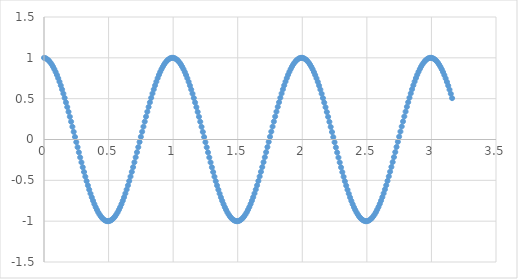
| Category | Series 0 |
|---|---|
| 0.0 | 1 |
| 0.01 | 0.996 |
| 0.02 | 0.988 |
| 0.03 | 0.976 |
| 0.04 | 0.961 |
| 0.05 | 0.941 |
| 0.060000000000000005 | 0.918 |
| 0.07 | 0.891 |
| 0.08 | 0.861 |
| 0.09 | 0.827 |
| 0.09999999999999999 | 0.79 |
| 0.10999999999999999 | 0.75 |
| 0.11999999999999998 | 0.707 |
| 0.12999999999999998 | 0.662 |
| 0.13999999999999999 | 0.613 |
| 0.15 | 0.562 |
| 0.16 | 0.509 |
| 0.17 | 0.454 |
| 0.18000000000000002 | 0.397 |
| 0.19000000000000003 | 0.339 |
| 0.20000000000000004 | 0.279 |
| 0.21000000000000005 | 0.218 |
| 0.22000000000000006 | 0.156 |
| 0.23000000000000007 | 0.094 |
| 0.24000000000000007 | 0.031 |
| 0.25000000000000006 | -0.032 |
| 0.26000000000000006 | -0.094 |
| 0.2700000000000001 | -0.157 |
| 0.2800000000000001 | -0.219 |
| 0.2900000000000001 | -0.279 |
| 0.3000000000000001 | -0.339 |
| 0.3100000000000001 | -0.398 |
| 0.3200000000000001 | -0.455 |
| 0.3300000000000001 | -0.51 |
| 0.34000000000000014 | -0.563 |
| 0.35000000000000014 | -0.613 |
| 0.36000000000000015 | -0.662 |
| 0.37000000000000016 | -0.708 |
| 0.38000000000000017 | -0.751 |
| 0.3900000000000002 | -0.791 |
| 0.4000000000000002 | -0.828 |
| 0.4100000000000002 | -0.861 |
| 0.4200000000000002 | -0.892 |
| 0.4300000000000002 | -0.918 |
| 0.4400000000000002 | -0.942 |
| 0.45000000000000023 | -0.961 |
| 0.46000000000000024 | -0.977 |
| 0.47000000000000025 | -0.988 |
| 0.48000000000000026 | -0.996 |
| 0.49000000000000027 | -1 |
| 0.5000000000000002 | -1 |
| 0.5100000000000002 | -0.996 |
| 0.5200000000000002 | -0.988 |
| 0.5300000000000002 | -0.976 |
| 0.5400000000000003 | -0.961 |
| 0.5500000000000003 | -0.941 |
| 0.5600000000000003 | -0.918 |
| 0.5700000000000003 | -0.891 |
| 0.5800000000000003 | -0.861 |
| 0.5900000000000003 | -0.827 |
| 0.6000000000000003 | -0.79 |
| 0.6100000000000003 | -0.75 |
| 0.6200000000000003 | -0.707 |
| 0.6300000000000003 | -0.661 |
| 0.6400000000000003 | -0.613 |
| 0.6500000000000004 | -0.562 |
| 0.6600000000000004 | -0.509 |
| 0.6700000000000004 | -0.454 |
| 0.6800000000000004 | -0.397 |
| 0.6900000000000004 | -0.338 |
| 0.7000000000000004 | -0.278 |
| 0.7100000000000004 | -0.218 |
| 0.7200000000000004 | -0.156 |
| 0.7300000000000004 | -0.093 |
| 0.7400000000000004 | -0.031 |
| 0.7500000000000004 | 0.032 |
| 0.7600000000000005 | 0.095 |
| 0.7700000000000005 | 0.157 |
| 0.7800000000000005 | 0.219 |
| 0.7900000000000005 | 0.28 |
| 0.8000000000000005 | 0.34 |
| 0.8100000000000005 | 0.398 |
| 0.8200000000000005 | 0.455 |
| 0.8300000000000005 | 0.51 |
| 0.8400000000000005 | 0.563 |
| 0.8500000000000005 | 0.614 |
| 0.8600000000000005 | 0.662 |
| 0.8700000000000006 | 0.708 |
| 0.8800000000000006 | 0.751 |
| 0.8900000000000006 | 0.791 |
| 0.9000000000000006 | 0.828 |
| 0.9100000000000006 | 0.862 |
| 0.9200000000000006 | 0.892 |
| 0.9300000000000006 | 0.919 |
| 0.9400000000000006 | 0.942 |
| 0.9500000000000006 | 0.961 |
| 0.9600000000000006 | 0.977 |
| 0.9700000000000006 | 0.988 |
| 0.9800000000000006 | 0.996 |
| 0.9900000000000007 | 1 |
| 1.0000000000000007 | 1 |
| 1.0100000000000007 | 0.996 |
| 1.0200000000000007 | 0.988 |
| 1.0300000000000007 | 0.976 |
| 1.0400000000000007 | 0.96 |
| 1.0500000000000007 | 0.941 |
| 1.0600000000000007 | 0.918 |
| 1.0700000000000007 | 0.891 |
| 1.0800000000000007 | 0.861 |
| 1.0900000000000007 | 0.827 |
| 1.1000000000000008 | 0.79 |
| 1.1100000000000008 | 0.75 |
| 1.1200000000000008 | 0.707 |
| 1.1300000000000008 | 0.661 |
| 1.1400000000000008 | 0.612 |
| 1.1500000000000008 | 0.561 |
| 1.1600000000000008 | 0.508 |
| 1.1700000000000008 | 0.453 |
| 1.1800000000000008 | 0.396 |
| 1.1900000000000008 | 0.338 |
| 1.2000000000000008 | 0.278 |
| 1.2100000000000009 | 0.217 |
| 1.2200000000000009 | 0.155 |
| 1.2300000000000009 | 0.093 |
| 1.2400000000000009 | 0.03 |
| 1.2500000000000009 | -0.033 |
| 1.260000000000001 | -0.095 |
| 1.270000000000001 | -0.158 |
| 1.280000000000001 | -0.22 |
| 1.290000000000001 | -0.28 |
| 1.300000000000001 | -0.34 |
| 1.310000000000001 | -0.399 |
| 1.320000000000001 | -0.455 |
| 1.330000000000001 | -0.51 |
| 1.340000000000001 | -0.564 |
| 1.350000000000001 | -0.614 |
| 1.360000000000001 | -0.663 |
| 1.370000000000001 | -0.708 |
| 1.380000000000001 | -0.751 |
| 1.390000000000001 | -0.791 |
| 1.400000000000001 | -0.828 |
| 1.410000000000001 | -0.862 |
| 1.420000000000001 | -0.892 |
| 1.430000000000001 | -0.919 |
| 1.440000000000001 | -0.942 |
| 1.450000000000001 | -0.961 |
| 1.460000000000001 | -0.977 |
| 1.470000000000001 | -0.988 |
| 1.480000000000001 | -0.996 |
| 1.490000000000001 | -1 |
| 1.500000000000001 | -1 |
| 1.5100000000000011 | -0.996 |
| 1.5200000000000011 | -0.988 |
| 1.5300000000000011 | -0.976 |
| 1.5400000000000011 | -0.96 |
| 1.5500000000000012 | -0.941 |
| 1.5600000000000012 | -0.918 |
| 1.5700000000000012 | -0.891 |
| 1.5800000000000012 | -0.86 |
| 1.5900000000000012 | -0.827 |
| 1.6000000000000012 | -0.79 |
| 1.6100000000000012 | -0.749 |
| 1.6200000000000012 | -0.706 |
| 1.6300000000000012 | -0.66 |
| 1.6400000000000012 | -0.612 |
| 1.6500000000000012 | -0.561 |
| 1.6600000000000013 | -0.508 |
| 1.6700000000000013 | -0.453 |
| 1.6800000000000013 | -0.396 |
| 1.6900000000000013 | -0.337 |
| 1.7000000000000013 | -0.277 |
| 1.7100000000000013 | -0.217 |
| 1.7200000000000013 | -0.155 |
| 1.7300000000000013 | -0.092 |
| 1.7400000000000013 | -0.03 |
| 1.7500000000000013 | 0.033 |
| 1.7600000000000013 | 0.096 |
| 1.7700000000000014 | 0.158 |
| 1.7800000000000014 | 0.22 |
| 1.7900000000000014 | 0.281 |
| 1.8000000000000014 | 0.341 |
| 1.8100000000000014 | 0.399 |
| 1.8200000000000014 | 0.456 |
| 1.8300000000000014 | 0.511 |
| 1.8400000000000014 | 0.564 |
| 1.8500000000000014 | 0.615 |
| 1.8600000000000014 | 0.663 |
| 1.8700000000000014 | 0.709 |
| 1.8800000000000014 | 0.752 |
| 1.8900000000000015 | 0.792 |
| 1.9000000000000015 | 0.829 |
| 1.9100000000000015 | 0.862 |
| 1.9200000000000015 | 0.892 |
| 1.9300000000000015 | 0.919 |
| 1.9400000000000015 | 0.942 |
| 1.9500000000000015 | 0.961 |
| 1.9600000000000015 | 0.977 |
| 1.9700000000000015 | 0.988 |
| 1.9800000000000015 | 0.996 |
| 1.9900000000000015 | 1 |
| 2.0000000000000013 | 1 |
| 2.010000000000001 | 0.996 |
| 2.020000000000001 | 0.988 |
| 2.0300000000000007 | 0.976 |
| 2.0400000000000005 | 0.96 |
| 2.0500000000000003 | 0.941 |
| 2.06 | 0.917 |
| 2.07 | 0.89 |
| 2.0799999999999996 | 0.86 |
| 2.0899999999999994 | 0.826 |
| 2.099999999999999 | 0.789 |
| 2.109999999999999 | 0.749 |
| 2.1199999999999988 | 0.706 |
| 2.1299999999999986 | 0.66 |
| 2.1399999999999983 | 0.611 |
| 2.149999999999998 | 0.561 |
| 2.159999999999998 | 0.507 |
| 2.1699999999999977 | 0.452 |
| 2.1799999999999975 | 0.395 |
| 2.1899999999999973 | 0.337 |
| 2.199999999999997 | 0.277 |
| 2.209999999999997 | 0.216 |
| 2.2199999999999966 | 0.154 |
| 2.2299999999999964 | 0.092 |
| 2.239999999999996 | 0.029 |
| 2.249999999999996 | -0.034 |
| 2.259999999999996 | -0.096 |
| 2.2699999999999956 | -0.159 |
| 2.2799999999999954 | -0.221 |
| 2.289999999999995 | -0.281 |
| 2.299999999999995 | -0.341 |
| 2.3099999999999947 | -0.4 |
| 2.3199999999999945 | -0.456 |
| 2.3299999999999943 | -0.511 |
| 2.339999999999994 | -0.564 |
| 2.349999999999994 | -0.615 |
| 2.3599999999999937 | -0.663 |
| 2.3699999999999934 | -0.709 |
| 2.3799999999999932 | -0.752 |
| 2.389999999999993 | -0.792 |
| 2.399999999999993 | -0.829 |
| 2.4099999999999926 | -0.862 |
| 2.4199999999999924 | -0.893 |
| 2.429999999999992 | -0.919 |
| 2.439999999999992 | -0.942 |
| 2.4499999999999917 | -0.961 |
| 2.4599999999999915 | -0.977 |
| 2.4699999999999913 | -0.989 |
| 2.479999999999991 | -0.996 |
| 2.489999999999991 | -1 |
| 2.4999999999999907 | -1 |
| 2.5099999999999905 | -0.996 |
| 2.5199999999999902 | -0.988 |
| 2.52999999999999 | -0.976 |
| 2.53999999999999 | -0.96 |
| 2.5499999999999896 | -0.94 |
| 2.5599999999999894 | -0.917 |
| 2.569999999999989 | -0.89 |
| 2.579999999999989 | -0.86 |
| 2.5899999999999888 | -0.826 |
| 2.5999999999999885 | -0.789 |
| 2.6099999999999883 | -0.749 |
| 2.619999999999988 | -0.706 |
| 2.629999999999988 | -0.66 |
| 2.6399999999999877 | -0.611 |
| 2.6499999999999875 | -0.56 |
| 2.6599999999999873 | -0.507 |
| 2.669999999999987 | -0.452 |
| 2.679999999999987 | -0.395 |
| 2.6899999999999866 | -0.336 |
| 2.6999999999999864 | -0.276 |
| 2.709999999999986 | -0.216 |
| 2.719999999999986 | -0.154 |
| 2.7299999999999858 | -0.091 |
| 2.7399999999999856 | -0.029 |
| 2.7499999999999853 | 0.034 |
| 2.759999999999985 | 0.097 |
| 2.769999999999985 | 0.159 |
| 2.7799999999999847 | 0.221 |
| 2.7899999999999845 | 0.282 |
| 2.7999999999999843 | 0.342 |
| 2.809999999999984 | 0.4 |
| 2.819999999999984 | 0.457 |
| 2.8299999999999836 | 0.512 |
| 2.8399999999999834 | 0.565 |
| 2.849999999999983 | 0.616 |
| 2.859999999999983 | 0.664 |
| 2.869999999999983 | 0.71 |
| 2.8799999999999826 | 0.752 |
| 2.8899999999999824 | 0.792 |
| 2.899999999999982 | 0.829 |
| 2.909999999999982 | 0.863 |
| 2.9199999999999817 | 0.893 |
| 2.9299999999999815 | 0.919 |
| 2.9399999999999813 | 0.942 |
| 2.949999999999981 | 0.962 |
| 2.959999999999981 | 0.977 |
| 2.9699999999999807 | 0.989 |
| 2.9799999999999804 | 0.996 |
| 2.9899999999999802 | 1 |
| 2.99999999999998 | 1 |
| 3.00999999999998 | 0.996 |
| 3.0199999999999796 | 0.988 |
| 3.0299999999999794 | 0.976 |
| 3.039999999999979 | 0.96 |
| 3.049999999999979 | 0.94 |
| 3.0599999999999787 | 0.917 |
| 3.0699999999999785 | 0.89 |
| 3.0799999999999783 | 0.86 |
| 3.089999999999978 | 0.826 |
| 3.099999999999978 | 0.789 |
| 3.1099999999999777 | 0.748 |
| 3.1199999999999775 | 0.705 |
| 3.1299999999999772 | 0.659 |
| 3.139999999999977 | 0.611 |
| 3.149999999999977 | 0.56 |
| 3.1599999999999766 | 0.506 |